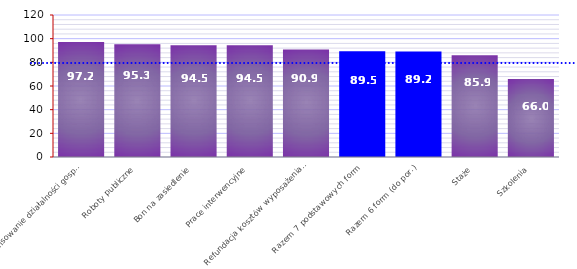
| Category | Efektywność zatrudnieniowa (w proc.) |
|---|---|
| Dofinansowanie działalności gospodarczej | 97.169 |
| Roboty publiczne | 95.259 |
| Bon na zasiedlenie | 94.53 |
| Prace interwencyjne | 94.459 |
| Refundacja kosztów wyposażenia lub doposażenia miejsca pracy | 90.869 |
| Razem 7 podstawowych form | 89.471 |
| Razem 6 form (do por.) | 89.171 |
| Staże | 85.896 |
| Szkolenia | 65.952 |